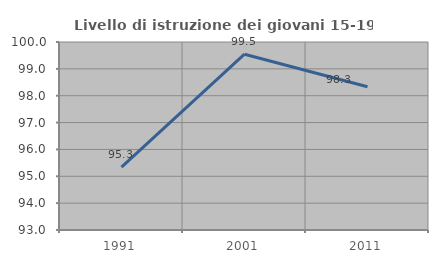
| Category | Livello di istruzione dei giovani 15-19 anni |
|---|---|
| 1991.0 | 95.342 |
| 2001.0 | 99.545 |
| 2011.0 | 98.333 |